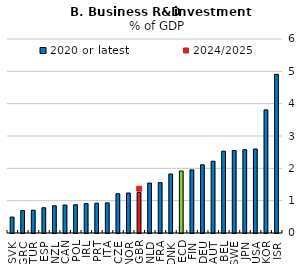
| Category | 2020 or latest |
|---|---|
| SVK | 0.493 |
| GRC | 0.694 |
| TUR | 0.706 |
| ESP | 0.781 |
| NZL | 0.841 |
| CAN | 0.865 |
| POL | 0.874 |
| IRL | 0.909 |
| PRT | 0.921 |
| ITA | 0.932 |
| CZE | 1.214 |
| NOR | 1.238 |
| GBR | 1.251 |
| NLD | 1.544 |
| FRA | 1.558 |
| DNK | 1.824 |
| OECD | 1.918 |
| FIN | 1.951 |
| DEU | 2.109 |
| AUT | 2.219 |
| BEL | 2.532 |
| SWE | 2.552 |
| JPN | 2.576 |
| USA | 2.599 |
| KOR | 3.807 |
| ISR | 4.908 |